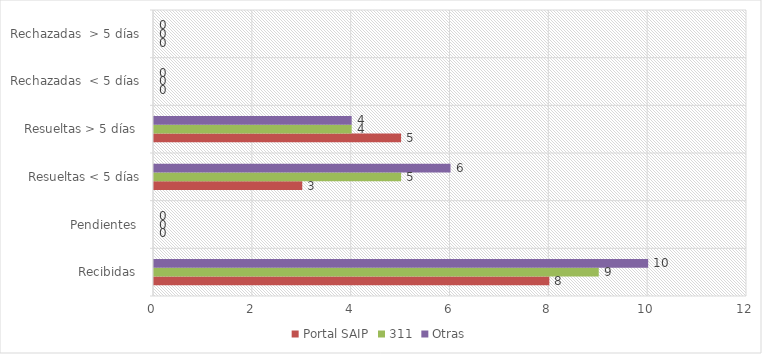
| Category | Portal SAIP | 311 | Otras |
|---|---|---|---|
| Recibidas  | 8 | 9 | 10 |
| Pendientes  | 0 | 0 | 0 |
| Resueltas < 5 días | 3 | 5 | 6 |
| Resueltas > 5 días  | 5 | 4 | 4 |
| Rechazadas  < 5 días | 0 | 0 | 0 |
| Rechazadas  > 5 días | 0 | 0 | 0 |